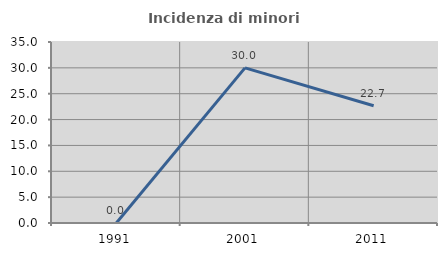
| Category | Incidenza di minori stranieri |
|---|---|
| 1991.0 | 0 |
| 2001.0 | 30 |
| 2011.0 | 22.667 |